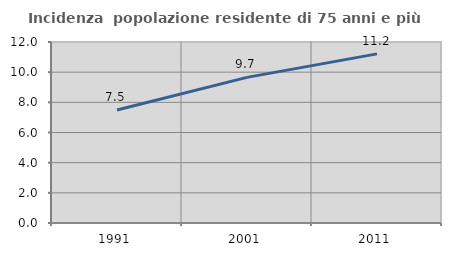
| Category | Incidenza  popolazione residente di 75 anni e più |
|---|---|
| 1991.0 | 7.493 |
| 2001.0 | 9.654 |
| 2011.0 | 11.213 |